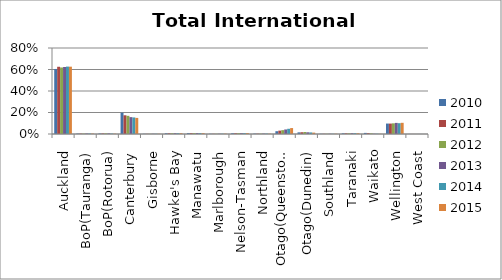
| Category | 2010 | 2011 | 2012 | 2013 | 2014 | 2015 |
|---|---|---|---|---|---|---|
| Auckland | 0.605 | 0.625 | 0.619 | 0.623 | 0.627 | 0.626 |
| BoP(Tauranga) | 0.004 | 0.004 | 0.004 | 0.005 | 0.005 | 0.004 |
| BoP(Rotorua) | 0.005 | 0.005 | 0.006 | 0.006 | 0.004 | 0.003 |
| Canterbury | 0.198 | 0.174 | 0.169 | 0.157 | 0.154 | 0.15 |
| Gisborne | 0.002 | 0.002 | 0.002 | 0.003 | 0.002 | 0.002 |
| Hawke's Bay | 0.007 | 0.007 | 0.007 | 0.008 | 0.007 | 0.008 |
| Manawatu | 0.008 | 0.008 | 0.009 | 0.009 | 0.008 | 0.008 |
| Marlborough | 0.002 | 0.002 | 0.002 | 0.003 | 0.003 | 0.003 |
| Nelson-Tasman | 0.007 | 0.007 | 0.008 | 0.008 | 0.008 | 0.009 |
| Northland | 0.004 | 0.003 | 0.003 | 0.004 | 0.004 | 0.003 |
| Otago(Queenstown) | 0.026 | 0.031 | 0.036 | 0.042 | 0.049 | 0.055 |
| Otago(Dunedin) | 0.015 | 0.017 | 0.019 | 0.016 | 0.015 | 0.013 |
| Southland | 0.002 | 0.002 | 0.002 | 0.003 | 0.002 | 0.003 |
| Taranaki | 0.007 | 0.006 | 0.007 | 0.008 | 0.008 | 0.007 |
| Waikato | 0.01 | 0.008 | 0.006 | 0.003 | 0.003 | 0.002 |
| Wellington | 0.097 | 0.097 | 0.099 | 0.103 | 0.101 | 0.104 |
| West Coast | 0 | 0 | 0 | 0 | 0 | 0 |